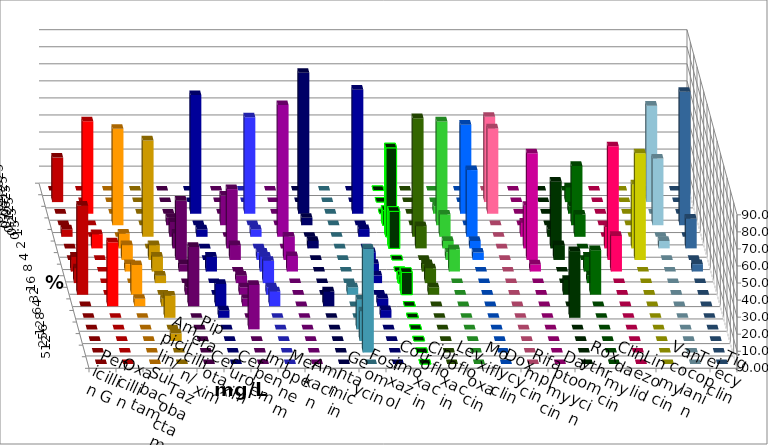
| Category | Penicillin G | Oxacillin | Ampicillin/ Sulbactam | Piperacillin/ Tazobactam | Cefotaxim | Cefuroxim | Imipenem | Meropenem | Amikacin | Gentamicin | Fosfomycin | Cotrimoxazol | Ciprofloxacin | Levofloxacin | Moxifloxacin | Doxycyclin | Rifampicin | Daptomycin | Roxythromycin | Clindamycin | Linezolid | Vancomycin | Teicoplanin | Tigecyclin |
|---|---|---|---|---|---|---|---|---|---|---|---|---|---|---|---|---|---|---|---|---|---|---|---|---|
| 0.015625 | 0 | 0 | 0 | 0 | 0 | 0 | 0 | 0 | 0 | 0 | 0 | 0 | 0 | 0 | 0 | 0 | 0 | 0 | 0 | 0 | 0 | 0 | 0 | 0 |
| 0.03125 | 26.087 | 0 | 0 | 0 | 0 | 0 | 0 | 0 | 0 | 0 | 0 | 0 | 0 | 0 | 0 | 0 | 50 | 0 | 0 | 8.696 | 0 | 0 | 0 | 56.522 |
| 0.0625 | 0 | 54.167 | 0 | 0 | 0 | 0 | 69.565 | 56.522 | 0 | 82.609 | 0 | 72.727 | 0 | 0 | 4.348 | 52.174 | 50 | 0 | 0 | 4.348 | 0 | 0 | 0 | 0 |
| 0.125 | 0 | 0 | 56.522 | 0 | 4.348 | 17.391 | 0 | 0 | 0 | 4.348 | 0 | 0 | 8.696 | 0 | 60.87 | 0 | 0 | 0 | 0 | 34.783 | 0 | 0 | 78.261 | 39.13 |
| 0.25 | 4.348 | 0 | 0 | 56.522 | 8.696 | 0 | 4.348 | 4.348 | 77.273 | 0 | 0 | 4.545 | 52.174 | 69.565 | 13.043 | 39.13 | 0 | 8.333 | 4.348 | 13.043 | 0 | 0 | 0 | 0 |
| 0.5 | 0 | 8.333 | 8.696 | 0 | 8.696 | 34.783 | 0 | 0 | 0 | 4.348 | 0 | 0 | 21.739 | 13.043 | 4.348 | 4.348 | 0 | 25 | 39.13 | 0 | 12.5 | 37.5 | 17.391 | 4.348 |
| 1.0 | 0 | 0 | 8.696 | 8.696 | 34.783 | 8.696 | 0 | 4.348 | 13.636 | 0 | 0 | 4.545 | 0 | 0 | 4.348 | 4.348 | 0 | 62.5 | 8.696 | 0 | 66.667 | 62.5 | 0 | 0 |
| 2.0 | 8.696 | 0 | 4.348 | 8.696 | 4.348 | 0 | 8.696 | 8.696 | 9.091 | 0 | 0 | 4.545 | 0 | 4.348 | 13.043 | 0 | 0 | 4.167 | 0 | 8.696 | 20.833 | 0 | 4.348 | 0 |
| 4.0 | 8.696 | 0 | 0 | 4.348 | 0 | 4.348 | 0 | 13.043 | 0 | 0 | 0 | 4.545 | 4.348 | 8.696 | 0 | 0 | 0 | 0 | 0 | 4.348 | 0 | 0 | 0 | 0 |
| 8.0 | 52.174 | 0 | 17.391 | 0 | 4.348 | 4.348 | 0 | 4.348 | 0 | 0 | 4.348 | 0 | 13.043 | 4.348 | 0 | 0 | 0 | 0 | 8.696 | 26.087 | 0 | 0 | 0 | 0 |
| 16.0 | 0 | 37.5 | 4.348 | 4.348 | 34.783 | 4.348 | 13.043 | 8.696 | 0 | 8.696 | 0 | 4.545 | 0 | 0 | 0 | 0 | 0 | 0 | 0 | 0 | 0 | 0 | 0 | 0 |
| 32.0 | 0 | 0 | 0 | 13.043 | 0 | 0 | 4.348 | 0 | 0 | 0 | 0 | 4.545 | 0 | 0 | 0 | 0 | 0 | 0 | 39.13 | 0 | 0 | 0 | 0 | 0 |
| 64.0 | 0 | 0 | 0 | 0 | 0 | 26.087 | 0 | 0 | 0 | 0 | 17.391 | 0 | 0 | 0 | 0 | 0 | 0 | 0 | 0 | 0 | 0 | 0 | 0 | 0 |
| 128.0 | 0 | 0 | 0 | 4.348 | 0 | 0 | 0 | 0 | 0 | 0 | 17.391 | 0 | 0 | 0 | 0 | 0 | 0 | 0 | 0 | 0 | 0 | 0 | 0 | 0 |
| 256.0 | 0 | 0 | 0 | 0 | 0 | 0 | 0 | 0 | 0 | 0 | 60.87 | 0 | 0 | 0 | 0 | 0 | 0 | 0 | 0 | 0 | 0 | 0 | 0 | 0 |
| 512.0 | 0 | 0 | 0 | 0 | 0 | 0 | 0 | 0 | 0 | 0 | 0 | 0 | 0 | 0 | 0 | 0 | 0 | 0 | 0 | 0 | 0 | 0 | 0 | 0 |